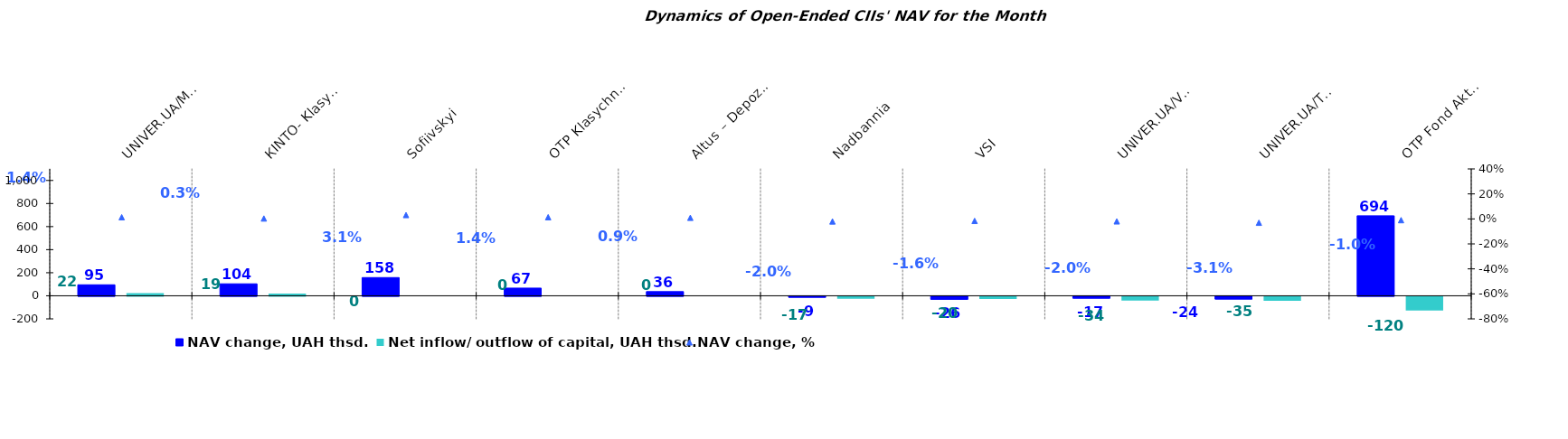
| Category | NAV change, UAH thsd. | Net inflow/ outflow of capital, UAH thsd. |
|---|---|---|
| UNIVER.UA/Myhailo Hrushevskyi: Fond Derzhavnykh Paperiv    | 95.275 | 22.356 |
| КІNТО- Klasychnyi | 103.716 | 18.98 |
| Sofiivskyi | 158.027 | 0 |
| ОТP Klasychnyi | 66.633 | 0 |
| Altus – Depozyt | 36.171 | 0 |
| Nadbannia | -8.976 | -17.399 |
| VSI | -26.22 | -20.081 |
| UNIVER.UA/Volodymyr Velykyi: Fond Zbalansovanyi | -16.816 | -34.214 |
| UNIVER.UA/Taras Shevchenko: Fond Zaoshchadzhen | -24.035 | -35.214 |
| ОТP Fond Aktsii | 693.718 | -120.176 |